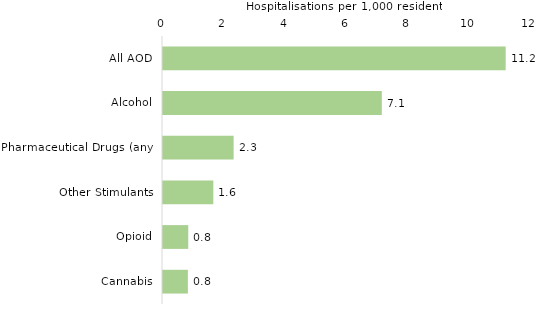
| Category | Series 0 |
|---|---|
| All AOD | 11.174 |
| Alcohol | 7.135 |
| Pharmaceutical Drugs (any) | 2.303 |
| Other Stimulants | 1.641 |
| Opioid | 0.823 |
| Cannabis | 0.811 |